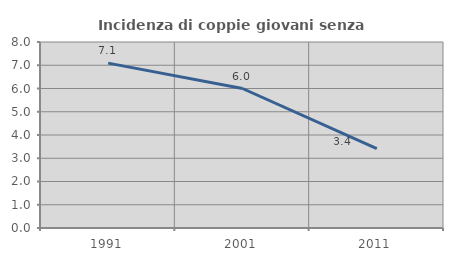
| Category | Incidenza di coppie giovani senza figli |
|---|---|
| 1991.0 | 7.092 |
| 2001.0 | 6 |
| 2011.0 | 3.419 |